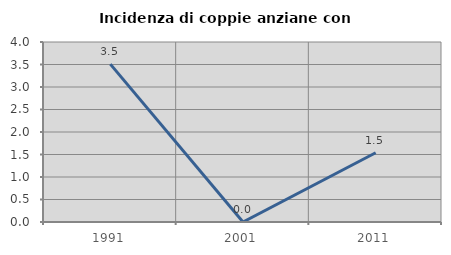
| Category | Incidenza di coppie anziane con figli |
|---|---|
| 1991.0 | 3.509 |
| 2001.0 | 0 |
| 2011.0 | 1.538 |